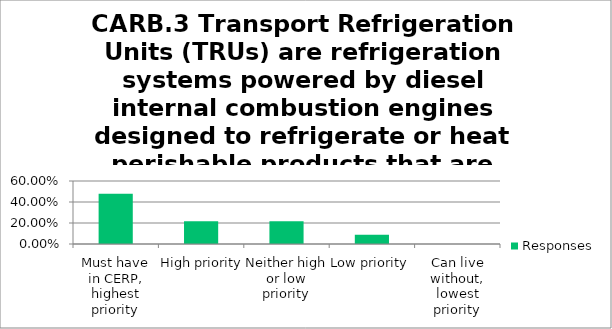
| Category | Responses |
|---|---|
| Must have in CERP, highest priority | 0.478 |
| High priority | 0.217 |
| Neither high or low priority | 0.217 |
| Low priority | 0.087 |
| Can live without, lowest priority | 0 |